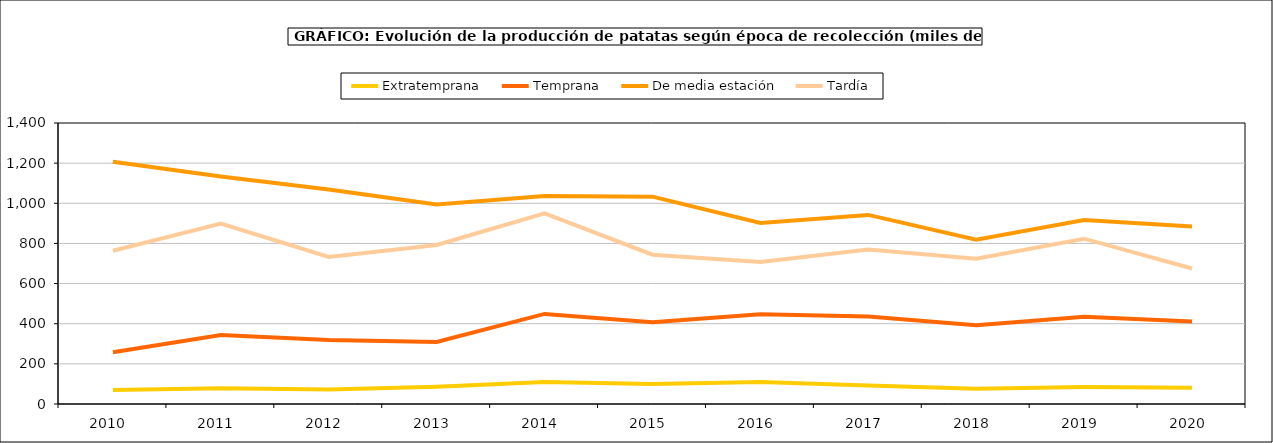
| Category | Extratemprana | Temprana | De media estación | Tardía |
|---|---|---|---|---|
| 2010.0 | 70.07 | 257.77 | 1206.438 | 763.371 |
| 2011.0 | 78.631 | 344.002 | 1133.685 | 898.783 |
| 2012.0 | 72.219 | 318.279 | 1068.752 | 733.034 |
| 2013.0 | 85.916 | 309.356 | 994.291 | 792.519 |
| 2014.0 | 109.861 | 448.841 | 1035.787 | 949.52 |
| 2015.0 | 100.12 | 407.098 | 1032.991 | 743.864 |
| 2016.0 | 109.713 | 447.057 | 902.038 | 707.396 |
| 2017.0 | 92.094 | 435.374 | 942.171 | 769.831 |
| 2018.0 | 76.034 | 392.675 | 818.353 | 723.871 |
| 2019.0 | 84.367 | 434.185 | 917.139 | 823.629 |
| 2020.0 | 81.156 | 410.992 | 884.716 | 674.969 |